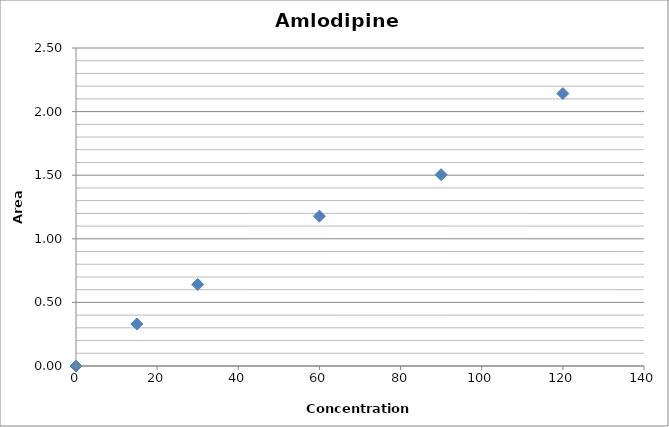
| Category | Series 0 |
|---|---|
| 0.0 | 0 |
| 15.0 | 0.33 |
| 30.0 | 0.641 |
| 60.0 | 1.178 |
| 90.0 | 1.504 |
| 120.0 | 2.142 |